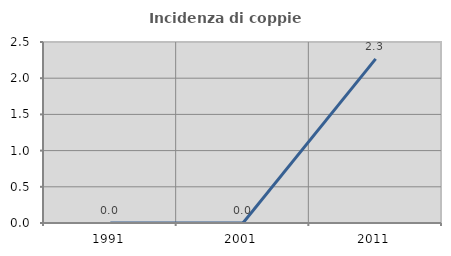
| Category | Incidenza di coppie miste |
|---|---|
| 1991.0 | 0 |
| 2001.0 | 0 |
| 2011.0 | 2.267 |